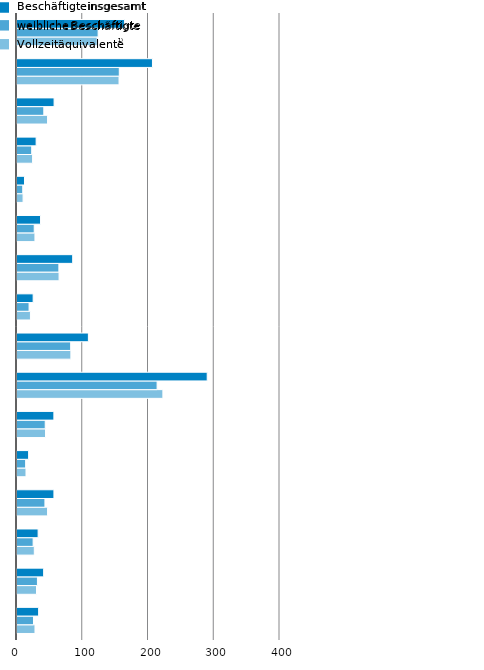
| Category | VZÄ | wB | iB |
|---|---|---|---|
| Thüringen      | 27.343 | 25.074 | 32.892 |
| Schleswig-Holstein | 29.677 | 31.067 | 40.523 |
| Sachsen-Anhalt | 26.322 | 24.537 | 32.128 |
| Sachsen        | 46.474 | 42.469 | 56.168 |
| Saarland | 13.681 | 13.144 | 17.668 |
| Rheinland-Pfalz | 43.389 | 42.925 | 56.09 |
| Nordrhein-Westfalen | 221.886 | 213.084 | 289.295 |
| Niedersachsen | 81.942 | 81.61 | 108.571 |
| Mecklenburg-Vorpommern | 20.455 | 18.348 | 24.567 |
| Hessen         | 63.993 | 63.695 | 84.698 |
| Hamburg | 27.29 | 26.193 | 35.819 |
| Bremen | 9.241 | 8.749 | 11.406 |
| Brandenburg | 23.71 | 22.364 | 29.103 |
| Berlin | 46.449 | 40.774 | 56.393 |
| Bayern | 155.183 | 155.562 | 206.015 |
| Baden-Württemberg | 121.966 | 123.405 | 163.666 |